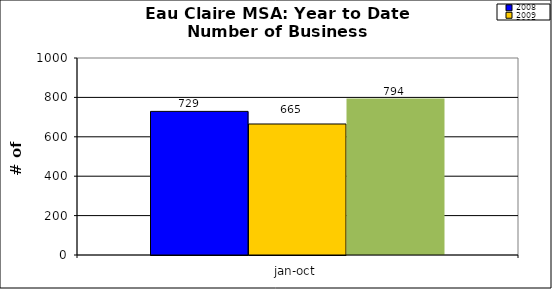
| Category | 2008 | 2009 | 2007 |
|---|---|---|---|
| 0 | 729 | 665 | 794 |